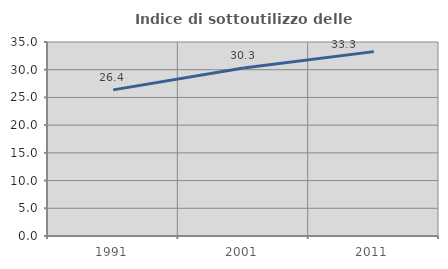
| Category | Indice di sottoutilizzo delle abitazioni  |
|---|---|
| 1991.0 | 26.366 |
| 2001.0 | 30.307 |
| 2011.0 | 33.263 |